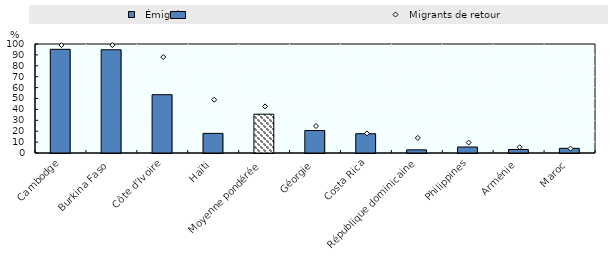
| Category |   Émigrés  |
|---|---|
| Cambodge | 95.1 |
| Burkina Faso | 94.7 |
| Côte d’Ivoire | 53.5 |
| Haïti | 18 |
| Moyenne pondérée  | 35.6 |
| Géorgie | 20.6 |
| Costa Rica | 17.7 |
| République dominicaine | 2.9 |
| Philippines | 5.5 |
| Arménie | 3.2 |
| Maroc | 4.3 |